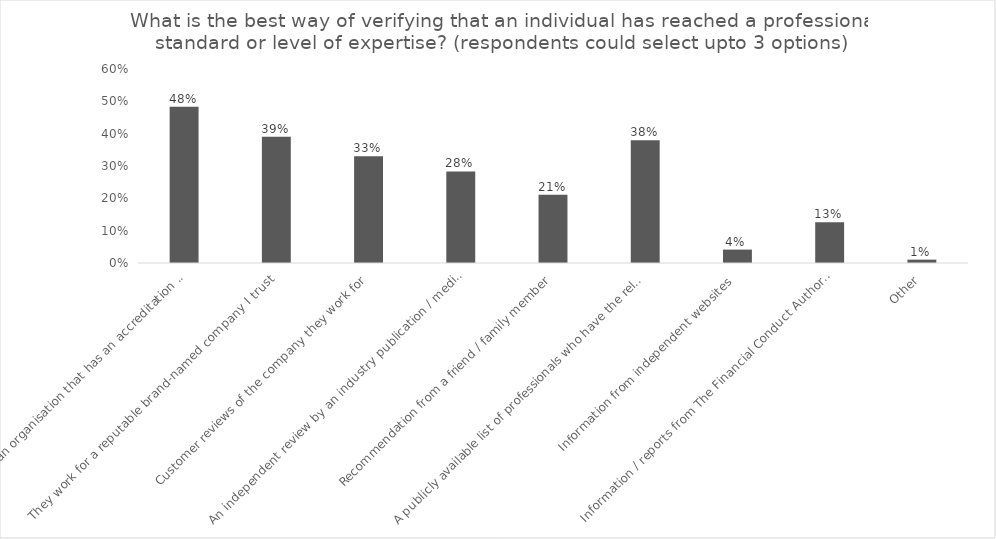
| Category | % of Respondents |
|---|---|
| They work for an organisation that has an accreditation or chartered status   | 0.484 |
| They work for a reputable brand-named company I trust | 0.39 |
| Customer reviews of the company they work for | 0.33 |
| An independent review by an industry publication / media outlet | 0.283 |
| Recommendation from a friend / family member | 0.211 |
| A publicly available list of professionals who have the relevant qualification | 0.38 |
| Information from independent websites  | 0.041 |
|  Information / reports from The Financial Conduct Authority (FCA) | 0.126 |
| Other | 0.01 |